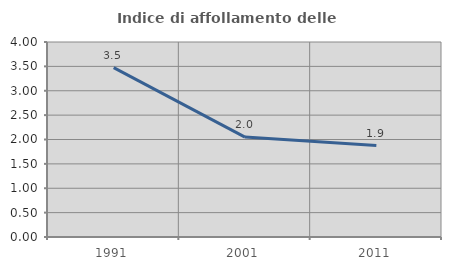
| Category | Indice di affollamento delle abitazioni  |
|---|---|
| 1991.0 | 3.475 |
| 2001.0 | 2.049 |
| 2011.0 | 1.877 |